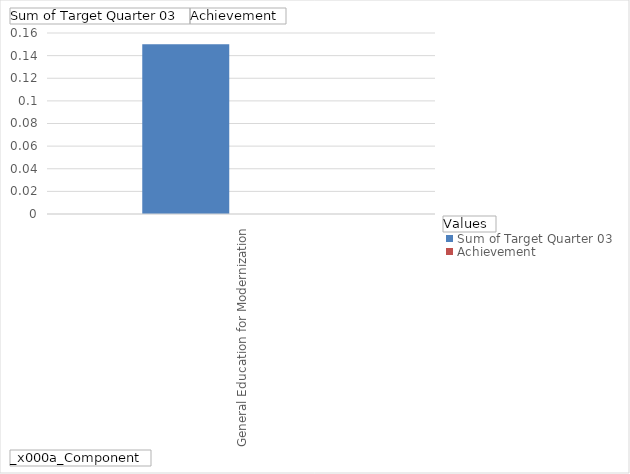
| Category | Sum of Target Quarter 03 | Achievement |
|---|---|---|
| General Education for Modernization | 0.15 | 0 |